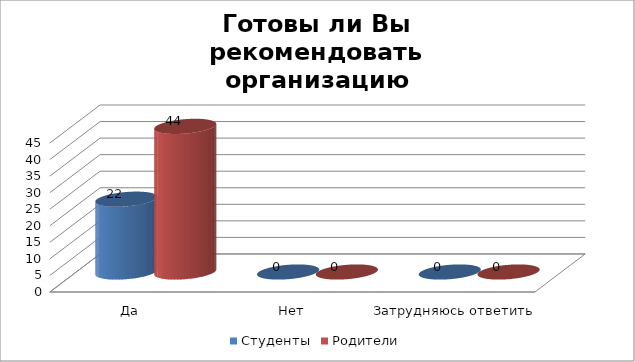
| Category | Студенты | Родители |
|---|---|---|
| Да | 22 | 44 |
| Нет | 0 | 0 |
| Затрудняюсь ответить | 0 | 0 |